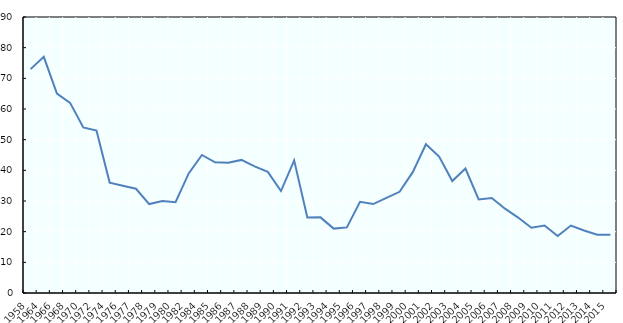
| Category | USA |
|---|---|
| 1958.0 | 73 |
| 1964.0 | 77 |
| 1966.0 | 65 |
| 1968.0 | 62 |
| 1970.0 | 54 |
| 1972.0 | 53 |
| 1974.0 | 36 |
| 1976.0 | 35 |
| 1977.0 | 34 |
| 1978.0 | 29 |
| 1979.0 | 30 |
| 1980.0 | 29.6 |
| 1982.0 | 39 |
| 1984.0 | 45 |
| 1985.0 | 42.6 |
| 1986.0 | 42.5 |
| 1987.0 | 43.4 |
| 1988.0 | 41.3 |
| 1989.0 | 39.5 |
| 1990.0 | 33.25 |
| 1991.0 | 43.25 |
| 1992.0 | 24.6 |
| 1993.0 | 24.66 |
| 1994.0 | 21 |
| 1995.0 | 21.4 |
| 1996.0 | 29.75 |
| 1997.0 | 29 |
| 1998.0 | 31 |
| 1999.0 | 33 |
| 2000.0 | 39.4 |
| 2001.0 | 48.5 |
| 2002.0 | 44.5 |
| 2003.0 | 36.5 |
| 2004.0 | 40.6 |
| 2005.0 | 30.5 |
| 2006.0 | 31 |
| 2007.0 | 27.5 |
| 2008.0 | 24.6 |
| 2009.0 | 21.3 |
| 2010.0 | 22 |
| 2011.0 | 18.6 |
| 2012.0 | 22 |
| 2013.0 | 20.4 |
| 2014.0 | 19 |
| 2015.0 | 19 |